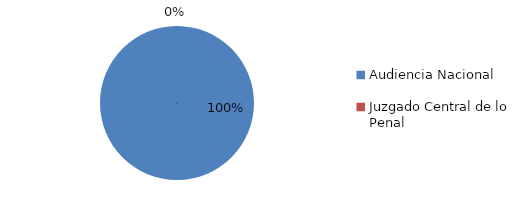
| Category | Series 0 |
|---|---|
| Audiencia Nacional | 29 |
| Juzgado Central de lo Penal | 0 |